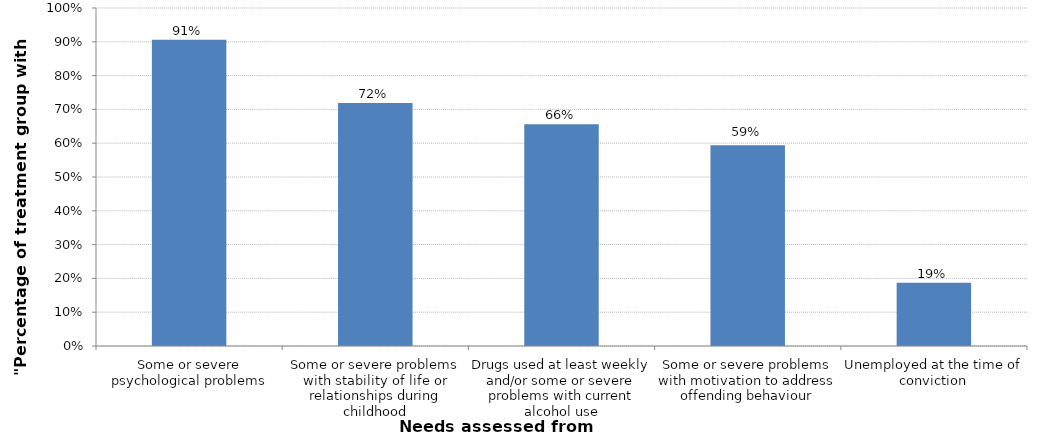
| Category | Series 0 |
|---|---|
| Some or severe psychological problems | 0.906 |
| Some or severe problems with stability of life or relationships during childhood | 0.719 |
| Drugs used at least weekly and/or some or severe problems with current alcohol use | 0.656 |
| Some or severe problems with motivation to address offending behaviour | 0.594 |
| Unemployed at the time of conviction | 0.188 |